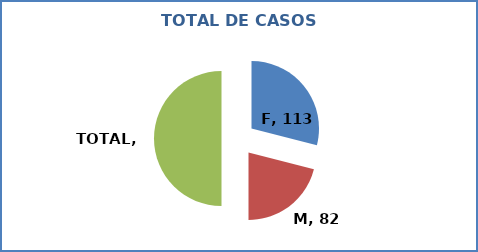
| Category | Series 0 |
|---|---|
| F | 113 |
| M | 82 |
| TOTAL | 195 |